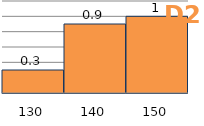
| Category | Series 1 |
|---|---|
| 130.0 | 0.3 |
| 140.0 | 0.9 |
| 150.0 | 1 |